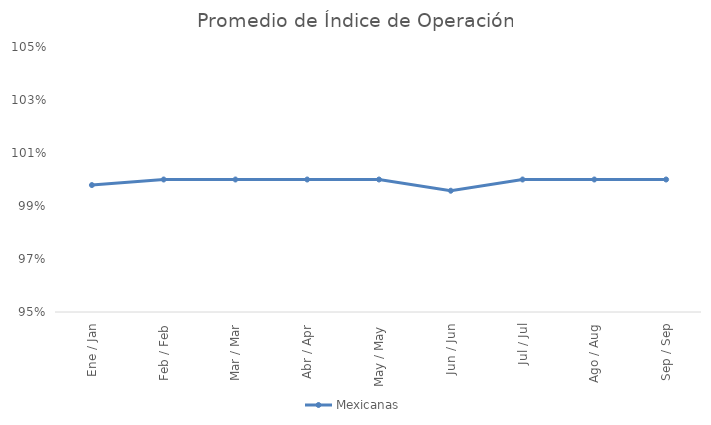
| Category | Mexicanas |
|---|---|
| Ene / Jan | 0.998 |
| Feb / Feb | 1 |
| Mar / Mar | 1 |
| Abr / Apr | 1 |
| May / May | 1 |
| Jun / Jun | 0.996 |
| Jul / Jul | 1 |
| Ago / Aug | 1 |
| Sep / Sep | 1 |